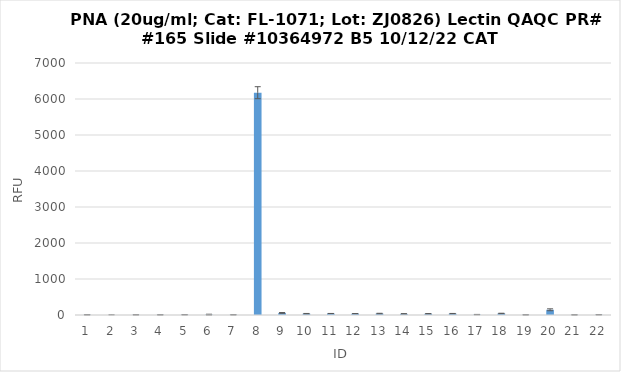
| Category | RFU |
|---|---|
| 0 | 6 |
| 1 | 1.5 |
| 2 | 5.5 |
| 3 | 5 |
| 4 | 7 |
| 5 | 11 |
| 6 | 5.75 |
| 7 | 6175 |
| 8 | 58 |
| 9 | 36.5 |
| 10 | 41.25 |
| 11 | 37.5 |
| 12 | 40 |
| 13 | 31.75 |
| 14 | 34.75 |
| 15 | 39 |
| 16 | 11.25 |
| 17 | 43.5 |
| 18 | 4.75 |
| 19 | 145 |
| 20 | 4 |
| 21 | 7.5 |